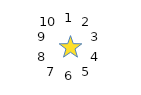
| Category | 3,960366345 |
|---|---|
| 0 | 3.96 |
| 1 | 1.584 |
| 2 | 3.96 |
| 3 | 1.584 |
| 4 | 3.96 |
| 5 | 1.584 |
| 6 | 3.96 |
| 7 | 1.584 |
| 8 | 3.96 |
| 9 | 1.584 |